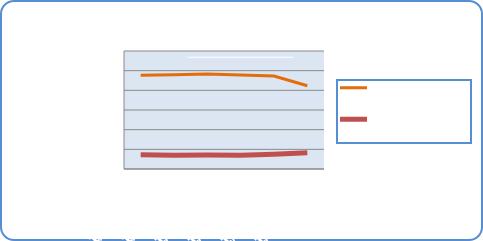
| Category | Motorin Türleri  | Benzin Türleri |
|---|---|---|
| 1/8/18 | 47661685.961 | 7199512.498 |
| 1/9/18 | 47943899.81 | 7039281.072 |
| 1/10/18 | 48247832.722 | 7151875.045 |
| 1/11/18 | 47739525.313 | 7027410.993 |
| 1/12/18 | 47255467.17 | 7554620.09 |
| 1/13/18 | 42351393.618 | 8261671.387 |